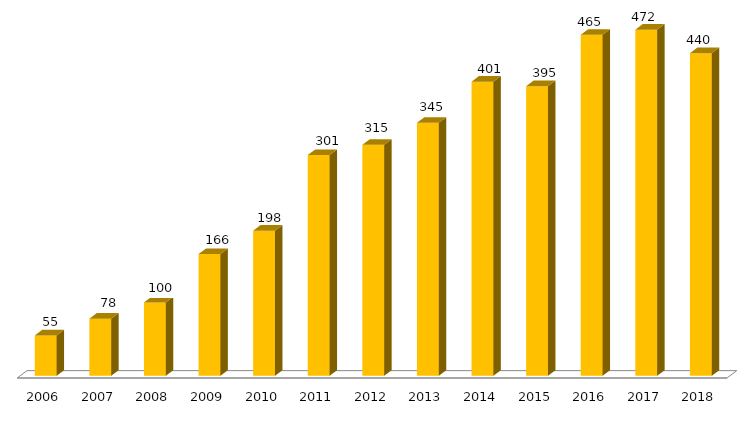
| Category | Programa |
|---|---|
| 2006.0 | 55 |
| 2007.0 | 78 |
| 2008.0 | 100 |
| 2009.0 | 166 |
| 2010.0 | 198 |
| 2011.0 | 301 |
| 2012.0 | 315 |
| 2013.0 | 345 |
| 2014.0 | 401 |
| 2015.0 | 395 |
| 2016.0 | 465 |
| 2017.0 | 472 |
| 2018.0 | 440 |